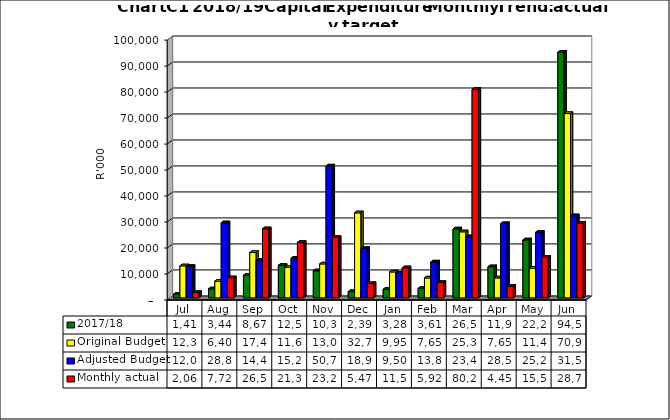
| Category | 2017/18 | Original Budget | Adjusted Budget | Monthly actual |
|---|---|---|---|---|
| Jul | 1419194.16 | 12305496 | 12069496 | 2062645.29 |
| Aug | 3446428.03 | 6409200 | 28862714 | 7723692.11 |
| Sep | 8678196.34 | 17428000 | 14425484 | 26579793.24 |
| Oct | 12521348.47 | 11660000 | 15251090 | 21347841.45 |
| Nov | 10392168.06 | 13046000 | 50732559 | 23254945.26 |
| Dec | 2392678.74 | 32714591 | 18971645 | 5478738.74 |
| Jan | 3280830.54 | 9950000 | 9500000 | 11559470.91 |
| Feb | 3612800.8 | 7650000 | 13800000 | 5921852.71 |
| Mar | 26513949.55 | 25394461 | 23493029 | 80220938.63 |
| Apr | 11961420.52 | 7650000 | 28555088 | 4454387.61 |
| May | 22284429.49 | 11400000 | 25207714 | 15548183.37 |
| Jun | 94518863.09 | 70909429 | 31584839.22 | 28743525.05 |